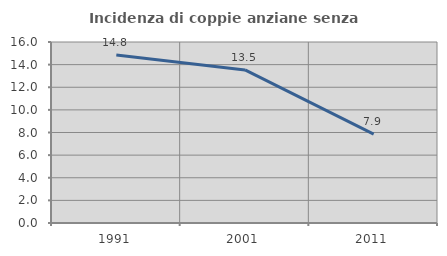
| Category | Incidenza di coppie anziane senza figli  |
|---|---|
| 1991.0 | 14.844 |
| 2001.0 | 13.534 |
| 2011.0 | 7.857 |